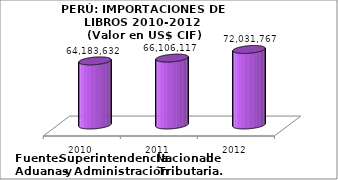
| Category | Series 1 |
|---|---|
| 2010.0 | 64183631.829 |
| 2011.0 | 66106116.678 |
| 2012.0 | 72031766.88 |